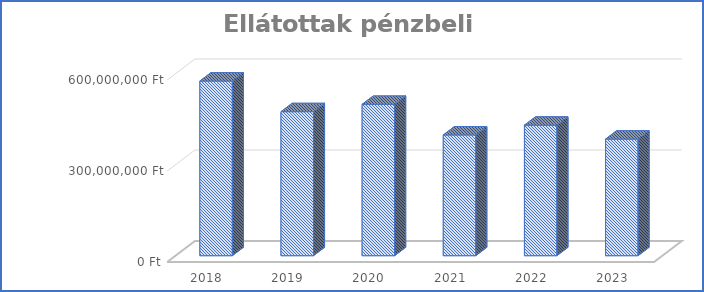
| Category | Ellátottak pénzbeli juttatásai |
|---|---|
| 2018.0 | 575850000 |
| 2019.0 | 474840000 |
| 2020.0 | 498932891 |
| 2021.0 | 398080000 |
| 2022.0 | 430280877 |
| 2023.0 | 384407330 |